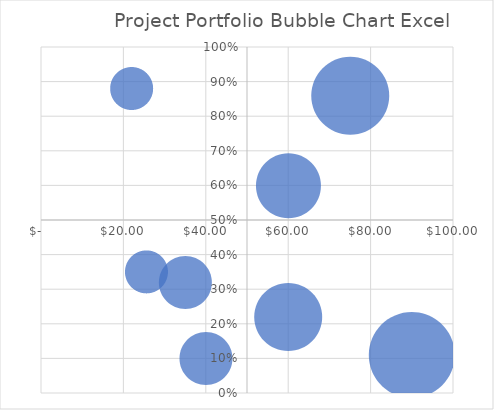
| Category | Project Portfolio Bubble Chart Excel |
|---|---|
| 40.0 | 0.1 |
| 25.6 | 0.35 |
| 22.0 | 0.88 |
| 60.0 | 0.22 |
| 75.0 | 0.86 |
| 35.0 | 0.32 |
| 90.0 | 0.11 |
| 60.0 | 0.6 |